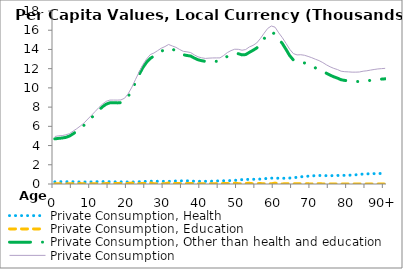
| Category | Private Consumption, Health | Private Consumption, Education | Private Consumption, Other than health and education | Private Consumption |
|---|---|---|---|---|
| 0 | 224.989 | 15.862 | 4695.556 | 4936.406 |
|  | 239.075 | 31.663 | 4748.94 | 5019.678 |
| 2 | 242.721 | 9.642 | 4784.421 | 5036.783 |
| 3 | 237.111 | 29.773 | 4852.072 | 5118.956 |
| 4 | 236.36 | 12.885 | 4991.101 | 5240.346 |
| 5 | 234.234 | 44.602 | 5227.621 | 5506.457 |
| 6 | 224.332 | 37.234 | 5497.815 | 5759.38 |
| 7 | 211.119 | 43.605 | 5793.666 | 6048.391 |
| 8 | 208.383 | 19.097 | 6134.52 | 6362 |
| 9 | 213.046 | 28.762 | 6521.135 | 6762.943 |
| 10 | 222.037 | 29.079 | 6901.407 | 7152.523 |
| 11 | 232.582 | 30.914 | 7288.271 | 7551.767 |
| 12 | 246.454 | 19.774 | 7690.687 | 7956.914 |
| 13 | 252.468 | 20.598 | 8042.922 | 8315.988 |
| 14 | 248.448 | 43.283 | 8308.545 | 8600.275 |
| 15 | 236.204 | 45.496 | 8448.75 | 8730.451 |
| 16 | 227.896 | 40.538 | 8465.496 | 8733.93 |
| 17 | 226.882 | 64.161 | 8438.701 | 8729.744 |
| 18 | 224.896 | 53.817 | 8468.384 | 8747.097 |
| 19 | 219.41 | 48.938 | 8654.682 | 8923.031 |
| 20 | 215.386 | 56.986 | 9127.811 | 9400.182 |
| 21 | 207.561 | 95.473 | 9779.683 | 10082.717 |
| 22 | 213.173 | 89.969 | 10588.516 | 10891.658 |
| 23 | 235.867 | 36.157 | 11410.632 | 11682.655 |
| 24 | 258.299 | 42.306 | 12126.751 | 12427.357 |
| 25 | 273.509 | 60.49 | 12667.479 | 13001.479 |
| 26 | 287.866 | 115.449 | 13061.734 | 13465.049 |
| 27 | 289.081 | 24.577 | 13315.792 | 13629.449 |
| 28 | 282.504 | 16.54 | 13574.211 | 13873.254 |
| 29 | 280.499 | 38.854 | 13808.083 | 14127.436 |
| 30 | 273.134 | 25.445 | 14000.795 | 14299.374 |
| 31 | 270.993 | 109.612 | 14135.803 | 14516.409 |
| 32 | 292.233 | 43.106 | 14026.195 | 14361.534 |
| 33 | 311.059 | 47.985 | 13860.004 | 14219.047 |
| 34 | 321.03 | 43.294 | 13630.389 | 13994.714 |
| 35 | 332.268 | 21.563 | 13450.586 | 13804.417 |
| 36 | 330.679 | 49.882 | 13370.191 | 13750.751 |
| 37 | 310.91 | 54.987 | 13313.166 | 13679.063 |
| 38 | 289.358 | 41.98 | 13104.845 | 13436.183 |
| 39 | 281.601 | 23.91 | 12927.571 | 13233.082 |
| 40 | 282.961 | 18.425 | 12830.696 | 13132.083 |
| 41 | 280.164 | 29.858 | 12756.741 | 13066.763 |
| 42 | 283.698 | 39.342 | 12773.753 | 13096.793 |
| 43 | 293.932 | 32.859 | 12789.169 | 13115.961 |
| 44 | 315.322 | 39.863 | 12765.496 | 13120.68 |
| 45 | 321.297 | 41.911 | 12759.586 | 13122.795 |
| 46 | 333.311 | 48.347 | 12989.067 | 13370.726 |
| 47 | 345.197 | 45.467 | 13283.943 | 13674.606 |
| 48 | 354.935 | 21.004 | 13502.009 | 13877.949 |
| 49 | 375.67 | 83.646 | 13563.31 | 14022.626 |
| 50 | 419.559 | 36.99 | 13555.799 | 14012.347 |
| 51 | 455.189 | 26.534 | 13435.652 | 13917.375 |
| 52 | 470.715 | 54.947 | 13464.892 | 13990.553 |
| 53 | 484.666 | 78.297 | 13697.569 | 14260.532 |
| 54 | 489.622 | 22.216 | 13911.554 | 14423.393 |
| 55 | 491.332 | 37.249 | 14147.561 | 14676.142 |
| 56 | 512.465 | 45.182 | 14574.923 | 15132.57 |
| 57 | 546.738 | 20.771 | 15112.474 | 15679.984 |
| 58 | 577.723 | 24.789 | 15585.534 | 16188.045 |
| 59 | 613.537 | 21.27 | 15804.704 | 16439.51 |
| 60 | 615.429 | 92.526 | 15608.645 | 16316.6 |
| 61 | 599.169 | 19.371 | 15109.504 | 15728.044 |
| 62 | 595.952 | 8.757 | 14612.056 | 15216.765 |
| 63 | 600.415 | 25.645 | 13995.14 | 14621.2 |
| 64 | 621.933 | 38.482 | 13352.038 | 14012.453 |
| 65 | 647.178 | 20.127 | 12898.092 | 13565.397 |
| 66 | 694.613 | 15.603 | 12720.322 | 13430.538 |
| 67 | 745.623 | 24.746 | 12679.576 | 13449.944 |
| 68 | 783.684 | 13.225 | 12598.057 | 13394.966 |
| 69 | 815.286 | 13.522 | 12446.139 | 13274.947 |
| 70 | 844.127 | 10.307 | 12286.606 | 13141.041 |
| 71 | 869.008 | 33.21 | 12079.132 | 12981.35 |
| 72 | 883.546 | 26.07 | 11926.15 | 12835.766 |
| 73 | 883.077 | 8.007 | 11743.102 | 12634.186 |
| 74 | 868.355 | 7.957 | 11520.851 | 12397.164 |
| 75 | 863.311 | 7.39 | 11323.616 | 12194.316 |
| 76 | 873.98 | 2.319 | 11154.846 | 12031.145 |
| 77 | 890.052 | 1.327 | 11016.549 | 11907.928 |
| 78 | 891.279 | 0.894 | 10845.271 | 11737.443 |
| 79 | 902.739 | 2.037 | 10779.715 | 11684.491 |
| 80 | 914.057 | 8.868 | 10742.067 | 11664.992 |
| 81 | 927.095 | 1.78 | 10709.593 | 11638.468 |
| 82 | 956.119 | 6.281 | 10675.159 | 11637.559 |
| 83 | 1004.725 | 0.267 | 10649.141 | 11654.133 |
| 84 | 1033.899 | 29.757 | 10673.536 | 11737.193 |
| 85 | 1053.431 | 0 | 10724.929 | 11778.36 |
| 86 | 1066.727 | 0.186 | 10783.756 | 11850.669 |
| 87 | 1078.072 | 0 | 10835.625 | 11913.696 |
| 88 | 1091.182 | 1.555 | 10877.468 | 11970.206 |
| 89 | 1093.529 | 0 | 10910.509 | 12004.038 |
| 90+ | 1091.76 | 0 | 10943.255 | 12035.015 |